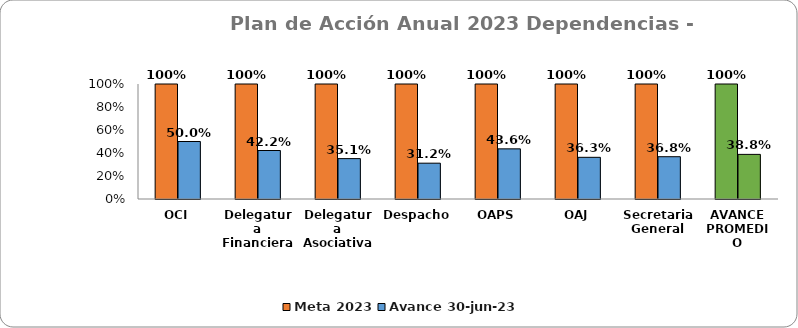
| Category | Meta 2023 | Avance 30-jun-23 |
|---|---|---|
| OCI | 1 | 0.5 |
| Delegatura Financiera | 1 | 0.422 |
| Delegatura Asociativa | 1 | 0.351 |
| Despacho | 1 | 0.312 |
| OAPS | 1 | 0.436 |
| OAJ | 1 | 0.362 |
| Secretaria General | 1 | 0.368 |
| AVANCE PROMEDIO | 1 | 0.388 |